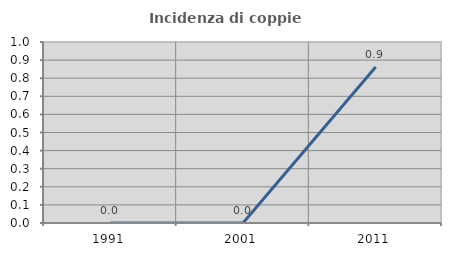
| Category | Incidenza di coppie miste |
|---|---|
| 1991.0 | 0 |
| 2001.0 | 0 |
| 2011.0 | 0.862 |